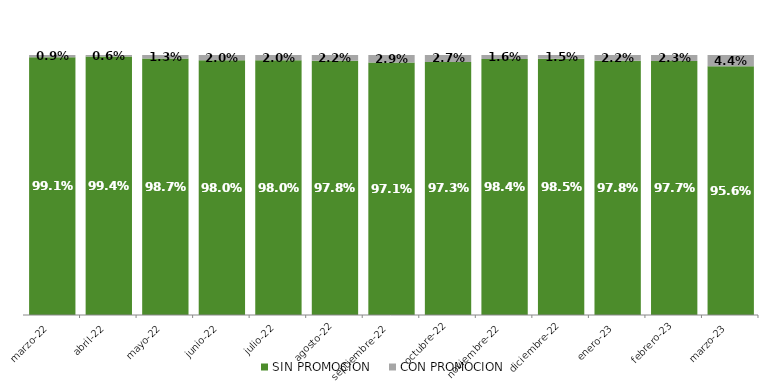
| Category | SIN PROMOCION   | CON PROMOCION   |
|---|---|---|
| 2022-03-01 | 0.991 | 0.009 |
| 2022-04-01 | 0.994 | 0.006 |
| 2022-05-01 | 0.987 | 0.013 |
| 2022-06-01 | 0.98 | 0.02 |
| 2022-07-01 | 0.98 | 0.02 |
| 2022-08-01 | 0.978 | 0.022 |
| 2022-09-01 | 0.971 | 0.029 |
| 2022-10-01 | 0.973 | 0.027 |
| 2022-11-01 | 0.984 | 0.016 |
| 2022-12-01 | 0.985 | 0.015 |
| 2023-01-01 | 0.978 | 0.022 |
| 2023-02-01 | 0.977 | 0.023 |
| 2023-03-01 | 0.956 | 0.044 |